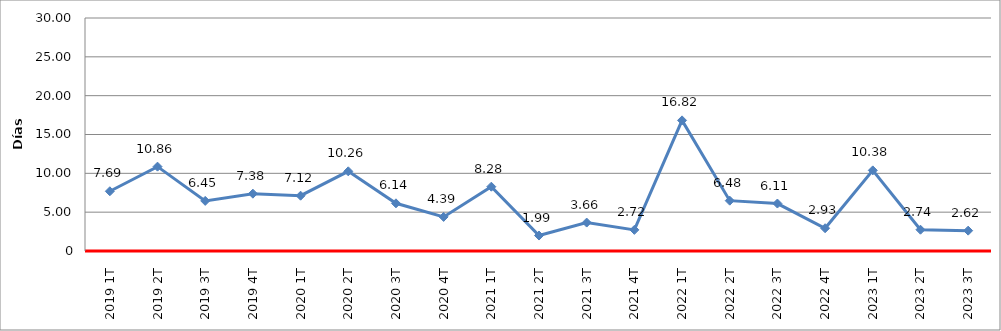
| Category | Total |
|---|---|
| 2019 1T | 7.69 |
| 2019 2T | 10.86 |
| 2019 3T | 6.45 |
| 2019 4T | 7.38 |
| 2020 1T | 7.12 |
| 2020 2T | 10.26 |
| 2020 3T | 6.14 |
| 2020 4T | 4.39 |
| 2021 1T | 8.28 |
| 2021 2T | 1.99 |
| 2021 3T | 3.66 |
| 2021 4T | 2.72 |
| 2022 1T | 16.82 |
| 2022 2T | 6.48 |
| 2022 3T | 6.11 |
| 2022 4T | 2.93 |
| 2023 1T | 10.38 |
| 2023 2T | 2.74 |
| 2023 3T | 2.62 |